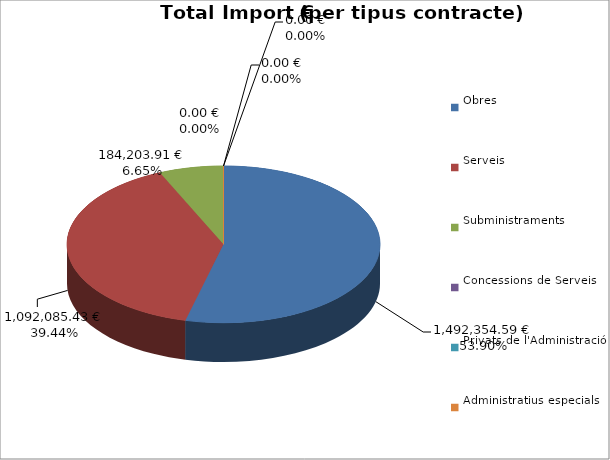
| Category | Total preu
(amb IVA) |
|---|---|
| Obres | 1492354.59 |
| Serveis | 1092085.43 |
| Subministraments | 184203.91 |
| Concessions de Serveis | 0 |
| Privats de l'Administració | 0 |
| Administratius especials | 0 |